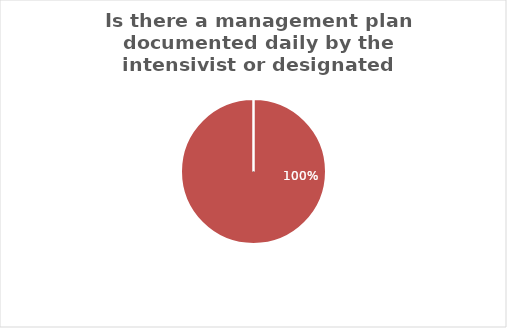
| Category | Is there a management plan documented daily by the intensivist or designated specialist? |
|---|---|
| Yes | 0 |
| No | 1 |